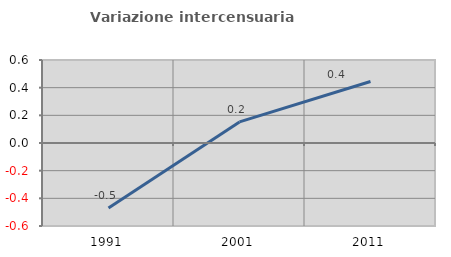
| Category | Variazione intercensuaria annua |
|---|---|
| 1991.0 | -0.47 |
| 2001.0 | 0.152 |
| 2011.0 | 0.445 |